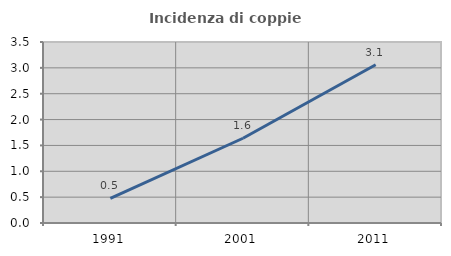
| Category | Incidenza di coppie miste |
|---|---|
| 1991.0 | 0.475 |
| 2001.0 | 1.639 |
| 2011.0 | 3.06 |